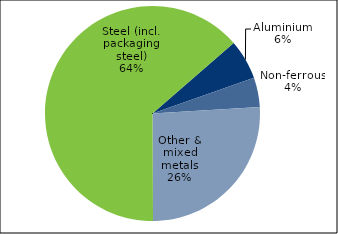
| Category | Series 0 |
|---|---|
| Aluminium | 87438 |
| Batteries | 0 |
| Car bodies | 0 |
| Non-ferrous | 64165 |
| Other & mixed metals | 376899 |
| Steel (incl. packaging steel) | 927077 |